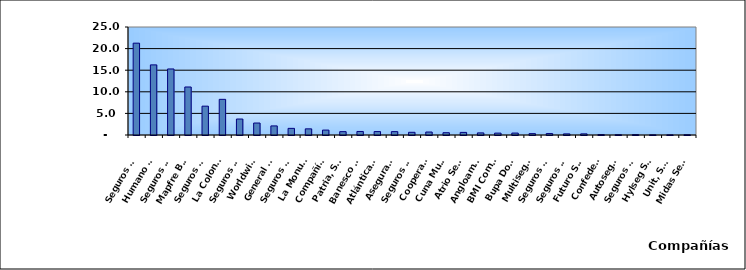
| Category | Series 0 |
|---|---|
| Seguros Universal, S. A. | 21.26 |
| Humano Seguros, S. A. | 16.232 |
| Seguros Reservas, S. A. | 15.285 |
| Mapfre BHD Compañía de Seguros | 11.114 |
| Seguros Sura, S.A. | 6.676 |
| La Colonial, S. A., Compañia De Seguros | 8.256 |
| Seguros Crecer, S. A. | 3.697 |
| Worldwide Seguros, S. A. | 2.773 |
| General de Seguros, S. A. | 2.103 |
| Seguros Pepín, S. A. | 1.535 |
| La Monumental de Seguros, S. A. | 1.424 |
| Compañía Dominicana de Seguros, C. por A. | 1.138 |
| Patria, S. A., Compañía de Seguros | 0.775 |
| Banesco Seguros | 0.814 |
| Atlántica Seguros, S. A. | 0.79 |
| Aseguradora Agropecuaria Dominicana, S. A. | 0.778 |
| Seguros La Internacional, S. A. | 0.623 |
| Cooperativa Nacional De Seguros, Inc  | 0.689 |
| Cuna Mutual Insurance Society Dominicana | 0.531 |
| Atrio Seguros S. A. | 0.602 |
| Angloamericana de Seguros, S. A. | 0.487 |
| BMI Compañía de Seguros, S. A. | 0.436 |
| Bupa Dominicana, S. A. | 0.448 |
| Multiseguros Su, S.A. | 0.315 |
| Seguros APS, S.R.L. | 0.331 |
| Seguros Ademi, S.A. | 0.257 |
| Futuro Seguros | 0.263 |
| Confederación del Canadá Dominicana, S. A. | 0.099 |
| Autoseguro, S. A. | 0.063 |
| Seguros Yunen, S.A. | 0.084 |
| Hylseg Seguros S.A | 0.035 |
| Unit, S.A. | 0.032 |
| Midas Seguros, S.A. | 0.054 |